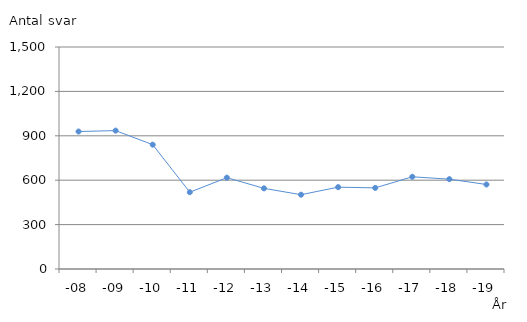
| Category | Antal svar, 12-18 år |
|---|---|
| -08 | 929 |
| -09 | 935 |
| -10 | 840 |
| -11 | 519 |
| -12 | 617 |
| -13 | 545 |
| -14 | 502 |
| -15 | 553 |
| -16 | 548 |
| -17 | 623 |
| -18 | 607 |
| -19 | 571 |